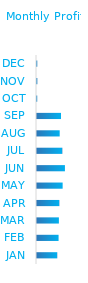
| Category | Total |
|---|---|
| JAN | 202555388 |
| FEB | 215832073 |
| MAR | 218865263 |
| APR | 223479795 |
| MAY | 256390979 |
| JUN | 279315076 |
| JUL | 253422679 |
| AUG | 226924597 |
| SEP | 240245540 |
| OCT | 2365469 |
| NOV | 3547293 |
| DEC | 2867992 |